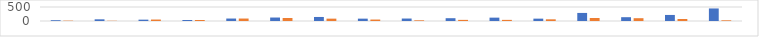
| Category | Series 0 | Series 1 |
|---|---|---|
| 7:00-8:00 | 28 | 12 |
| 8:00-9:00 | 60 | 8 |
| 9:00-10:00 | 48 | 52 |
| 10:00-11:00 | 36 | 36 |
| 11:00-12:00 | 88 | 88 |
| 12:00-13:00 | 124 | 108 |
| 13:00-14:00 | 144 | 84 |
| 14:00-15:00 | 84 | 52 |
| 15:00-16:00 | 88 | 24 |
| 16:00-17:00 | 100 | 40 |
| 17:00-18:00 | 120 | 40 |
| 18:00-19:00 | 84 | 60 |
| 19:00-20:00 | 288 | 108 |
| 20:00-21:00 | 136 | 100 |
| 21:00-22:00 | 216 | 72 |
| 22:00-23:00 | 448 | 24 |